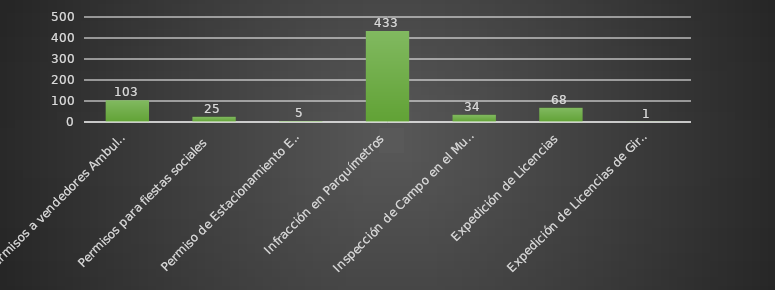
| Category | INDICADOR  |
|---|---|
| Permisos a vendedores Ambulantes | 103 |
| Permisos para fiestas sociales | 25 |
| Permiso de Estacionamiento Exclusivo para Discapacitados | 5 |
| Infracción en Parquímetros | 433 |
| Inspección de Campo en el Municipio | 34 |
| Expedición de Licencias | 68 |
| Expedición de Licencias de Giros Restringidos | 1 |